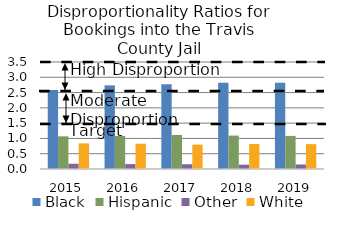
| Category | Black | Hispanic | Other | White |
|---|---|---|---|---|
| 2015.0 | 2.583 | 1.069 | 0.172 | 0.839 |
| 2016.0 | 2.737 | 1.082 | 0.161 | 0.827 |
| 2017.0 | 2.773 | 1.114 | 0.156 | 0.798 |
| 2018.0 | 2.817 | 1.093 | 0.142 | 0.816 |
| 2019.0 | 2.817 | 1.083 | 0.148 | 0.813 |